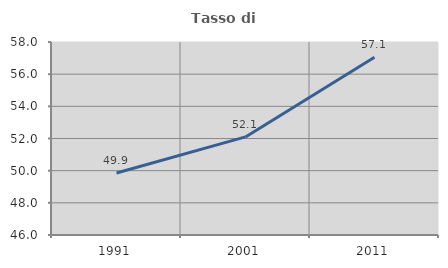
| Category | Tasso di occupazione   |
|---|---|
| 1991.0 | 49.854 |
| 2001.0 | 52.098 |
| 2011.0 | 57.055 |